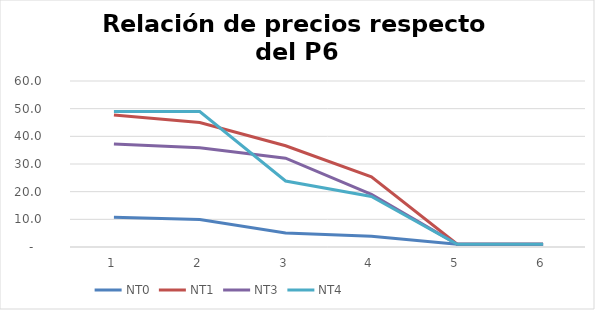
| Category | NT0 | NT1 | NT3 | NT4 |
|---|---|---|---|---|
| 0 | 10.785 | 47.718 | 37.241 | 48.96 |
| 1 | 9.956 | 44.983 | 35.856 | 48.96 |
| 2 | 5.063 | 36.599 | 32.096 | 23.85 |
| 3 | 3.861 | 25.362 | 19.009 | 18.243 |
| 4 | 1 | 1 | 1 | 1 |
| 5 | 1 | 1 | 1 | 1 |